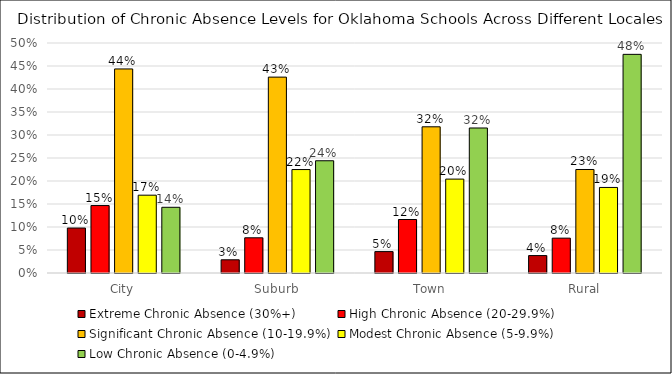
| Category | Extreme Chronic Absence (30%+) | High Chronic Absence (20-29.9%) | Significant Chronic Absence (10-19.9%) | Modest Chronic Absence (5-9.9%) | Low Chronic Absence (0-4.9%) |
|---|---|---|---|---|---|
| City | 0.098 | 0.147 | 0.444 | 0.169 | 0.143 |
| Suburb | 0.029 | 0.077 | 0.426 | 0.225 | 0.244 |
| Town | 0.047 | 0.116 | 0.318 | 0.204 | 0.315 |
| Rural | 0.038 | 0.076 | 0.225 | 0.186 | 0.475 |